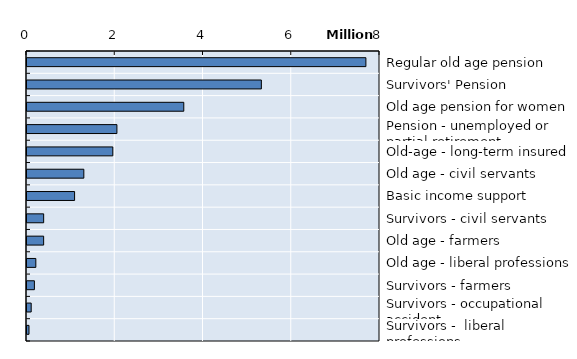
| Category | Series 0 |
|---|---|
| Regular old age pension | 7680279 |
| Survivors' Pension | 5311373 |
| Old age pension for women | 3553338 |
| Pension - unemployed or partial retirement | 2037582 |
| Old-age - long-term insured | 1944945 |
| Old age - civil servants | 1288210 |
| Basic income support  | 1078521 |
| Survivors - civil servants | 377725 |
| Old age - farmers | 377388 |
| Old age - liberal professions | 200227 |
| Survivors - farmers | 167509 |
| Survivors - occupational accident | 95033 |
| Survivors -  liberal professions | 45678 |